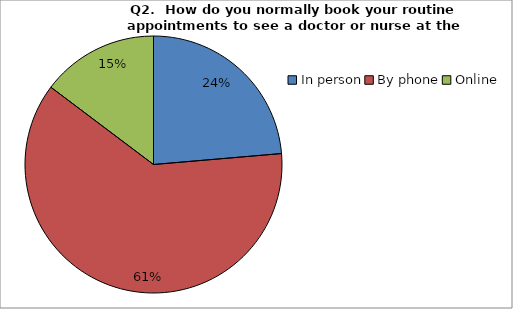
| Category | Series 0 |
|---|---|
| In person | 122 |
| By phone | 318 |
| Online | 76 |